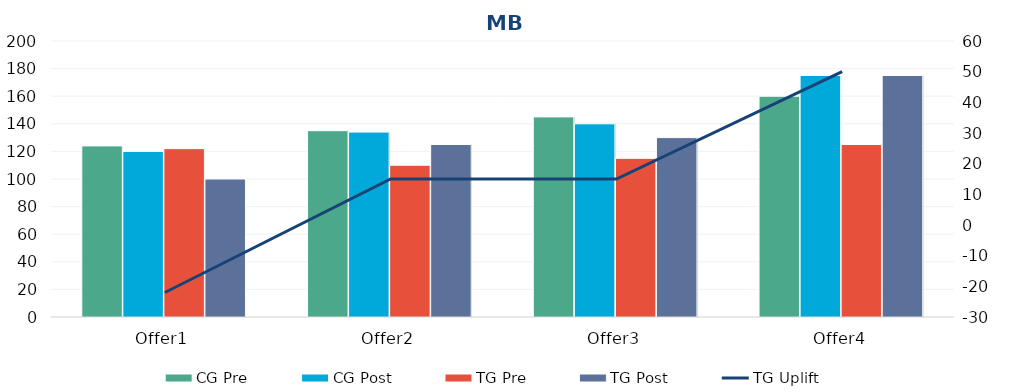
| Category | CG Pre | CG Post | TG Pre | TG Post |
|---|---|---|---|---|
| Offer1 | 124 | 120 | 122 | 100 |
| Offer2 | 135 | 134 | 110 | 125 |
| Offer3 | 145 | 140 | 115 | 130 |
| Offer4 | 160 | 175 | 125 | 175 |